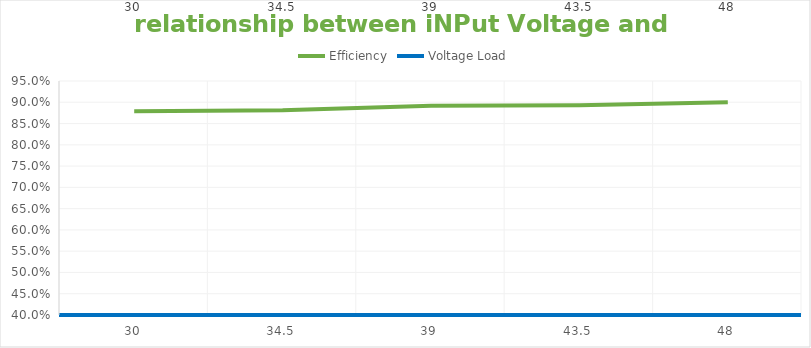
| Category | Efficiency | Voltage Load |
|---|---|---|
| 30.0 | 0.879 | 30 |
| 34.5 | 0.881 | 34.5 |
| 39.0 | 0.892 | 39 |
| 43.5 | 0.893 | 43.5 |
| 48.0 | 0.9 | 48 |